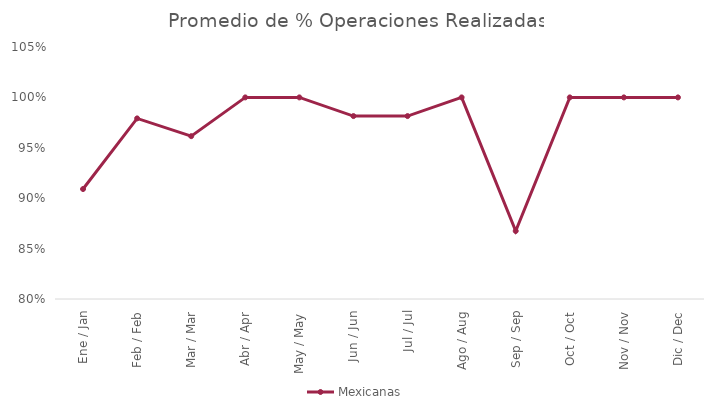
| Category | Mexicanas |
|---|---|
| Ene / Jan | 0.909 |
| Feb / Feb | 0.979 |
| Mar / Mar | 0.962 |
| Abr / Apr | 1 |
| May / May | 1 |
| Jun / Jun | 0.981 |
| Jul / Jul | 0.981 |
| Ago / Aug | 1 |
| Sep / Sep | 0.867 |
| Oct / Oct | 1 |
| Nov / Nov | 1 |
| Dic / Dec | 1 |